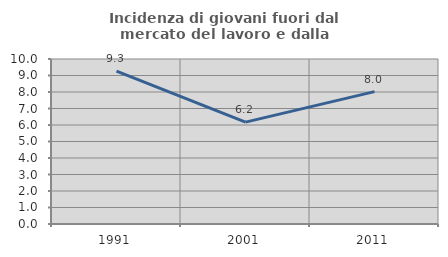
| Category | Incidenza di giovani fuori dal mercato del lavoro e dalla formazione  |
|---|---|
| 1991.0 | 9.259 |
| 2001.0 | 6.175 |
| 2011.0 | 8.021 |